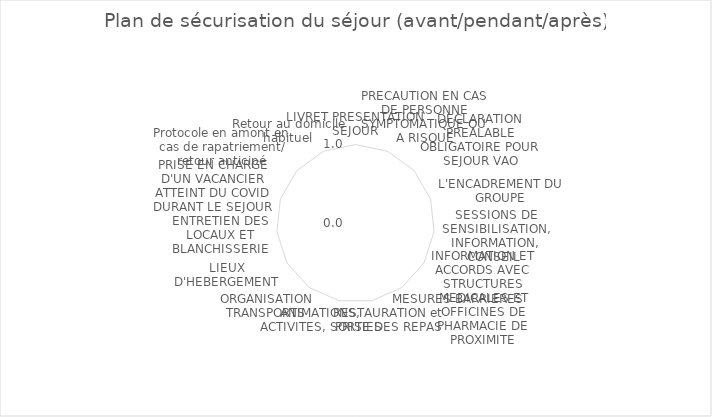
| Category | Series 0 |
|---|---|
| LIVRET PRESENTATION SEJOUR | 0 |
| PRECAUTION EN CAS DE PERSONNE SYMPTOMATIQUE OU A RISQUE | 0 |
| DECLARATION PREALABLE OBLIGATOIRE POUR SEJOUR VAO | 0 |
| L'ENCADREMENT DU GROUPE | 0 |
| SESSIONS DE SENSIBILISATION, INFORMATION, CONSEIL  | 0 |
| INFORMATION ET ACCORDS AVEC STRUCTURES MEDICALES ET OFFICINES DE PHARMACIE DE PROXIMITE | 0 |
| MESURES BARRIERES | 0 |
| RESTAURATION et PRISE DES REPAS | 0 |
| ANIMATIONS, ACTIVITES, SORTIES | 0 |
| ORGANISATION TRANSPORTS | 0 |
| LIEUX D'HEBERGEMENT | 0 |
| ENTRETIEN DES LOCAUX ET BLANCHISSERIE | 0 |
| PRISE EN CHARGE D'UN VACANCIER ATTEINT DU COVID DURANT LE SEJOUR | 0 |
| Protocole en amont en cas de rapatriement/ retour anticipé | 0 |
| Retour au domicile habituel  | 0 |